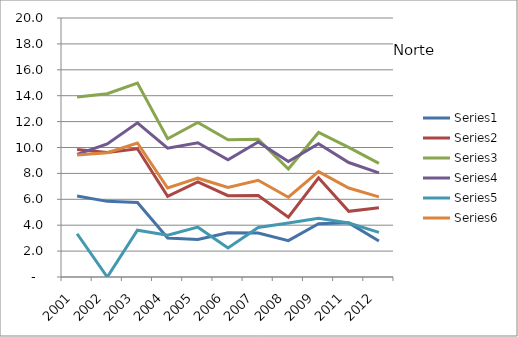
| Category | Series 0 | Series 1 | Series 2 | Series 3 | Series 4 | Series 5 |
|---|---|---|---|---|---|---|
| 2001.0 | 6.25 | 9.84 | 13.9 | 9.47 | 3.34 | 9.42 |
| 2002.0 | 5.84 | 9.61 | 14.15 | 10.28 | 0 | 9.6 |
| 2003.0 | 5.75 | 9.9 | 14.98 | 11.91 | 3.61 | 10.35 |
| 2004.0 | 3.01 | 6.23 | 10.67 | 9.95 | 3.23 | 6.87 |
| 2005.0 | 2.89 | 7.35 | 11.93 | 10.37 | 3.85 | 7.63 |
| 2006.0 | 3.41 | 6.28 | 10.59 | 9.05 | 2.24 | 6.92 |
| 2007.0 | 3.39 | 6.3 | 10.63 | 10.43 | 3.82 | 7.47 |
| 2008.0 | 2.81 | 4.62 | 8.34 | 8.92 | 4.17 | 6.16 |
| 2009.0 | 4.12 | 7.66 | 11.16 | 10.29 | 4.54 | 8.14 |
| 2011.0 | 4.18 | 5.07 | 10.01 | 8.84 | 4.17 | 6.87 |
| 2012.0 | 2.78 | 5.35 | 8.77 | 8.04 | 3.45 | 6.19 |